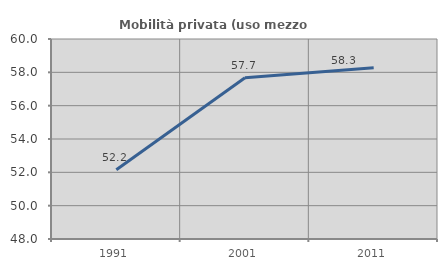
| Category | Mobilità privata (uso mezzo privato) |
|---|---|
| 1991.0 | 52.158 |
| 2001.0 | 57.678 |
| 2011.0 | 58.271 |